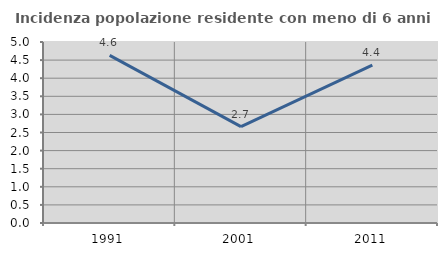
| Category | Incidenza popolazione residente con meno di 6 anni |
|---|---|
| 1991.0 | 4.632 |
| 2001.0 | 2.663 |
| 2011.0 | 4.361 |